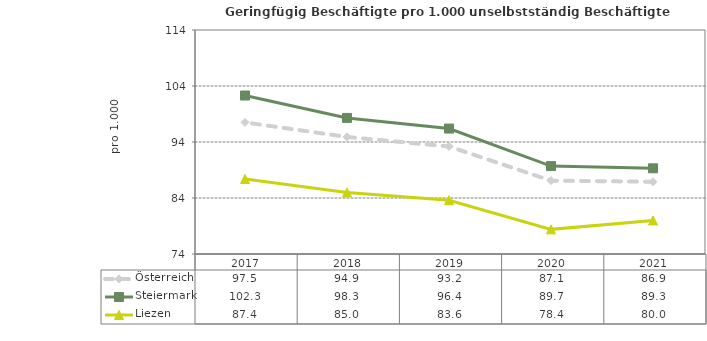
| Category | Österreich | Steiermark | Liezen |
|---|---|---|---|
| 2021.0 | 86.9 | 89.3 | 80 |
| 2020.0 | 87.1 | 89.7 | 78.4 |
| 2019.0 | 93.2 | 96.4 | 83.6 |
| 2018.0 | 94.9 | 98.3 | 85 |
| 2017.0 | 97.5 | 102.3 | 87.4 |